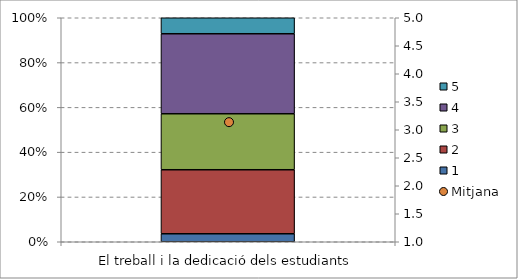
| Category | 1 | 2 | 3 | 4 | 5 |
|---|---|---|---|---|---|
| El treball i la dedicació dels estudiants | 0.036 | 0.286 | 0.25 | 0.357 | 0.071 |